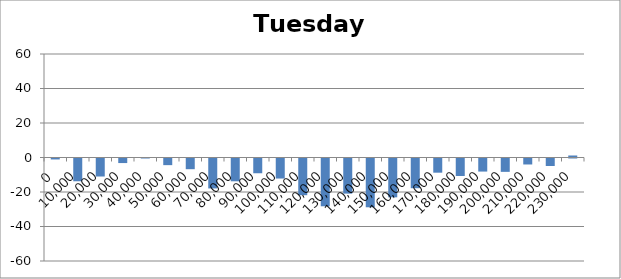
| Category | Tuesday 48 |
|---|---|
| 0.0 | -0.55 |
| 10000.0 | -13.2 |
| 20000.0 | -10.44 |
| 30000.0 | -2.645 |
| 40000.0 | 0.18 |
| 50000.0 | -3.85 |
| 60000.0 | -6.2 |
| 70000.0 | -17.36 |
| 80000.0 | -13.215 |
| 90000.0 | -8.55 |
| 100000.0 | -11.61 |
| 110000.0 | -21.27 |
| 120000.0 | -27.7 |
| 130000.0 | -20.365 |
| 140000.0 | -28.275 |
| 150000.0 | -22.5 |
| 160000.0 | -17.225 |
| 170000.0 | -8.22 |
| 180000.0 | -10.16 |
| 190000.0 | -7.58 |
| 200000.0 | -7.745 |
| 210000.0 | -3.465 |
| 220000.0 | -4.34 |
| 230000.0 | 1.165 |